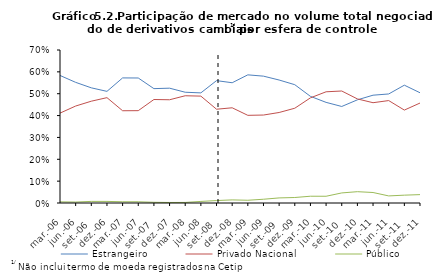
| Category | Estrangeiro | Privado Nacional | Público |
|---|---|---|---|
| 2006-03-01 | 0.584 | 0.411 | 0.005 |
| 2006-06-01 | 0.552 | 0.444 | 0.004 |
| 2006-09-01 | 0.527 | 0.466 | 0.007 |
| 2006-12-01 | 0.511 | 0.482 | 0.007 |
| 2007-03-01 | 0.572 | 0.422 | 0.006 |
| 2007-06-01 | 0.572 | 0.422 | 0.006 |
| 2007-09-01 | 0.523 | 0.473 | 0.003 |
| 2007-12-01 | 0.525 | 0.472 | 0.002 |
| 2008-03-01 | 0.507 | 0.491 | 0.003 |
| 2008-06-01 | 0.504 | 0.489 | 0.007 |
| 2008-09-01 | 0.56 | 0.429 | 0.011 |
| 2008-12-01 | 0.55 | 0.436 | 0.014 |
| 2009-03-01 | 0.586 | 0.401 | 0.013 |
| 2009-06-01 | 0.58 | 0.402 | 0.017 |
| 2009-09-01 | 0.563 | 0.414 | 0.023 |
| 2009-12-01 | 0.541 | 0.434 | 0.025 |
| 2010-03-01 | 0.488 | 0.481 | 0.031 |
| 2010-06-01 | 0.46 | 0.509 | 0.031 |
| 2010-09-01 | 0.442 | 0.512 | 0.046 |
| 2010-12-01 | 0.472 | 0.476 | 0.052 |
| 2011-03-01 | 0.493 | 0.459 | 0.048 |
| 2011-06-01 | 0.499 | 0.469 | 0.032 |
| 2011-09-01 | 0.539 | 0.425 | 0.036 |
| 2011-12-01 | 0.504 | 0.457 | 0.038 |